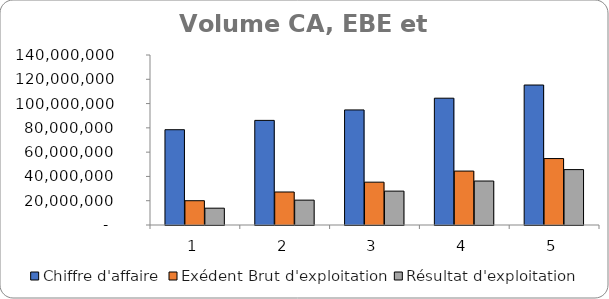
| Category | Chiffre d'affaire | Exédent Brut d'exploitation | Résultat d'exploitation |
|---|---|---|---|
| 0 | 78475000 | 20005400 | 13856750.476 |
| 1 | 86158250 | 27181650 | 20476431.273 |
| 2 | 94769147.5 | 35275737.5 | 27897093.304 |
| 3 | 104429874.425 | 44409634.125 | 36215401.325 |
| 4 | 115279409.033 | 54722102.964 | 45622131.56 |